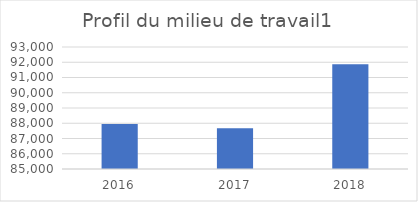
| Category | Series 0 |
|---|---|
| 2016.0 | 87950 |
| 2017.0 | 87665 |
| 2018.0 | 91868 |